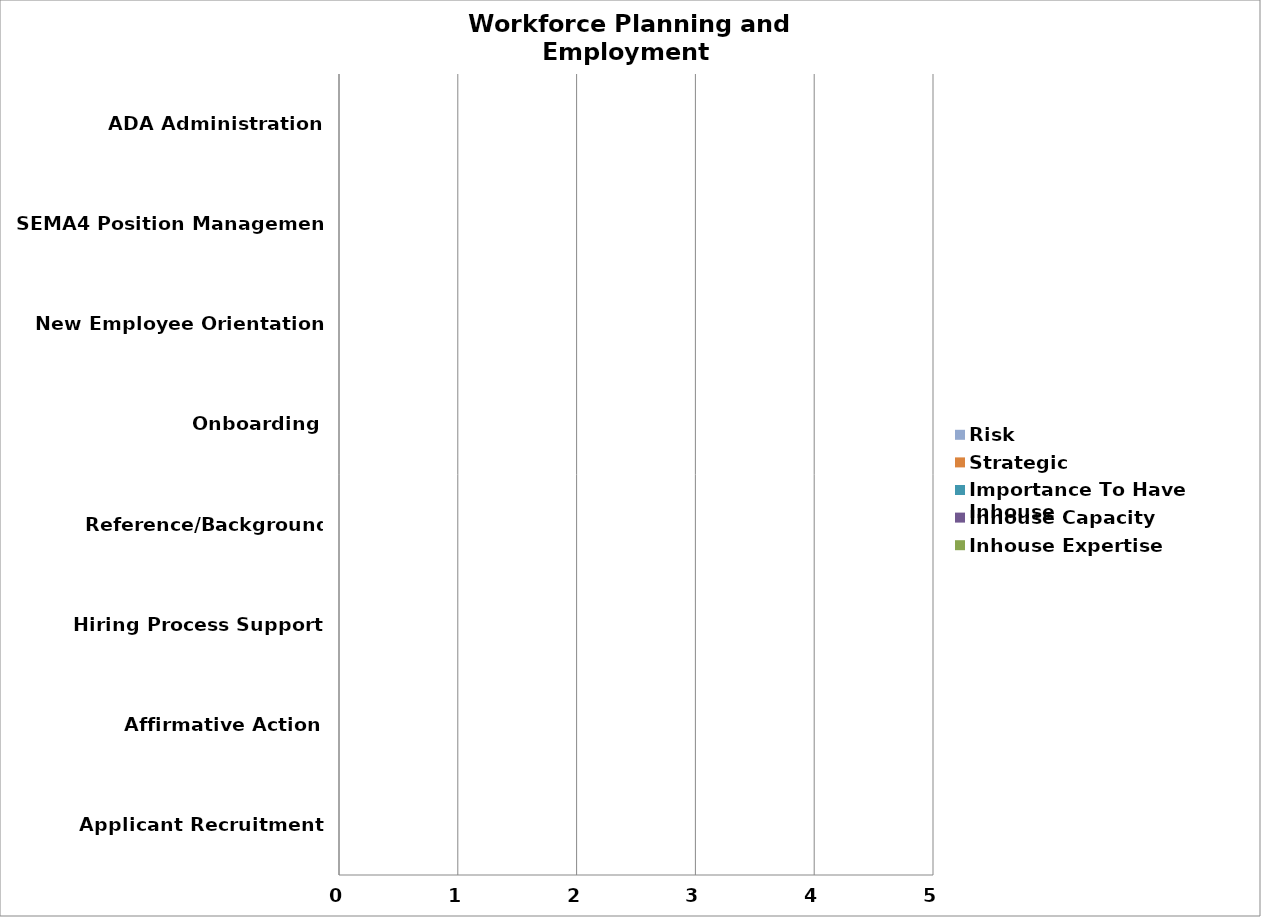
| Category | Inhouse Expertise | Inhouse Capacity | Importance To Have Inhouse | Strategic | Risk |
|---|---|---|---|---|---|
| Applicant Recruitment | 0 | 0 | 0 | 0 | 0 |
| Affirmative Action | 0 | 0 | 0 | 0 | 0 |
| Hiring Process Support | 0 | 0 | 0 | 0 | 0 |
| Reference/Background Checking | 0 | 0 | 0 | 0 | 0 |
| Onboarding | 0 | 0 | 0 | 0 | 0 |
| New Employee Orientation | 0 | 0 | 0 | 0 | 0 |
| SEMA4 Position Management | 0 | 0 | 0 | 0 | 0 |
| ADA Administration | 0 | 0 | 0 | 0 | 0 |